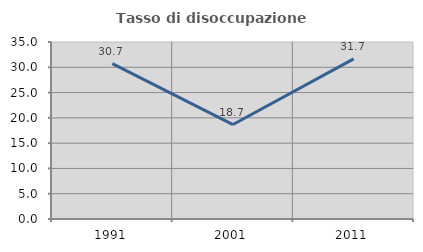
| Category | Tasso di disoccupazione giovanile  |
|---|---|
| 1991.0 | 30.728 |
| 2001.0 | 18.676 |
| 2011.0 | 31.667 |